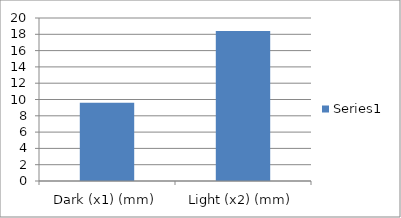
| Category | Series 0 |
|---|---|
| Dark (x1) (mm) | 9.6 |
| Light (x2) (mm) | 18.4 |